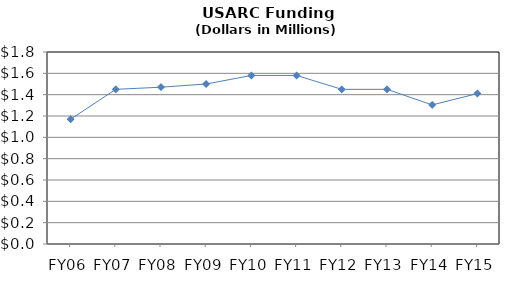
| Category | Series 0 |
|---|---|
| FY06 | 1.17 |
| FY07 | 1.45 |
| FY08 | 1.47 |
| FY09 | 1.5 |
| FY10 | 1.58 |
| FY11 | 1.58 |
| FY12 | 1.45 |
| FY13 | 1.45 |
| FY14 | 1.304 |
| FY15 | 1.41 |